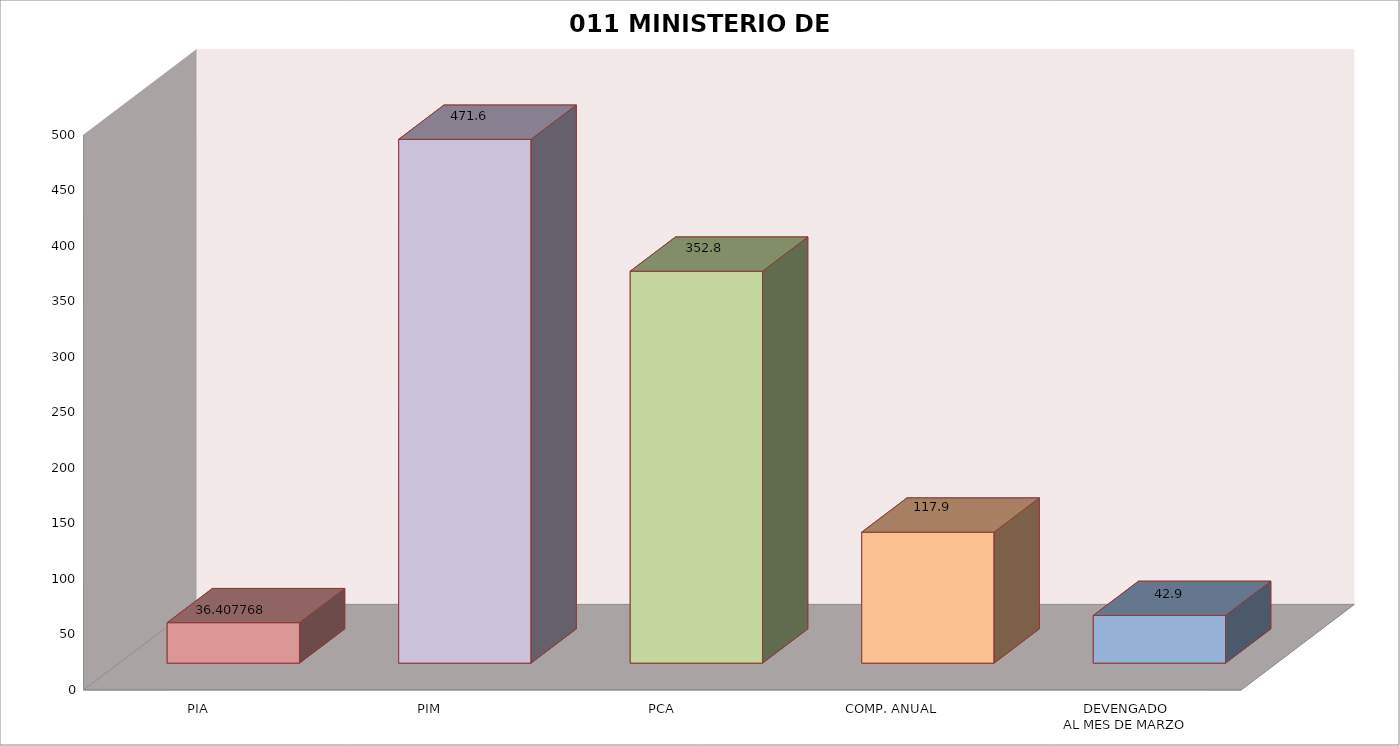
| Category | 011 MINISTERIO DE SALUD |
|---|---|
| PIA | 36.408 |
| PIM | 471.573 |
| PCA | 352.815 |
| COMP. ANUAL | 117.895 |
| DEVENGADO
AL MES DE MARZO | 42.935 |